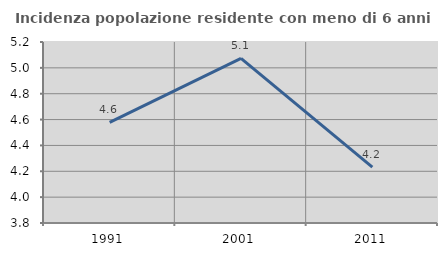
| Category | Incidenza popolazione residente con meno di 6 anni |
|---|---|
| 1991.0 | 4.579 |
| 2001.0 | 5.074 |
| 2011.0 | 4.232 |